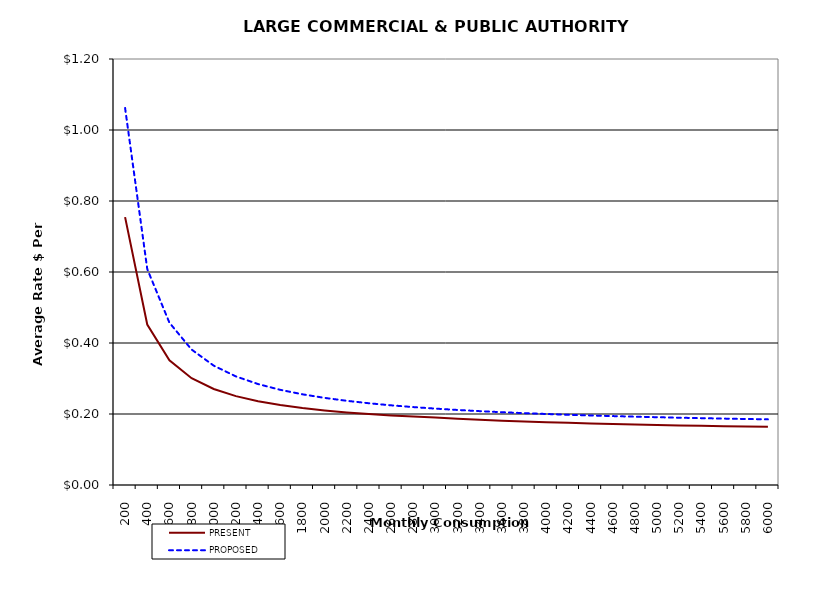
| Category | PRESENT | PROPOSED |
|---|---|---|
| 200.0 | 0.755 | 1.062 |
| 400.0 | 0.452 | 0.608 |
| 600.0 | 0.351 | 0.457 |
| 800.0 | 0.301 | 0.382 |
| 1000.0 | 0.27 | 0.336 |
| 1200.0 | 0.25 | 0.306 |
| 1400.0 | 0.236 | 0.284 |
| 1600.0 | 0.225 | 0.268 |
| 1800.0 | 0.217 | 0.255 |
| 2000.0 | 0.21 | 0.245 |
| 2200.0 | 0.204 | 0.237 |
| 2400.0 | 0.2 | 0.23 |
| 2600.0 | 0.196 | 0.224 |
| 2800.0 | 0.193 | 0.219 |
| 3000.0 | 0.19 | 0.215 |
| 3200.0 | 0.187 | 0.211 |
| 3400.0 | 0.184 | 0.208 |
| 3600.0 | 0.181 | 0.205 |
| 3800.0 | 0.179 | 0.202 |
| 4000.0 | 0.177 | 0.2 |
| 4200.0 | 0.175 | 0.198 |
| 4400.0 | 0.173 | 0.196 |
| 4600.0 | 0.172 | 0.194 |
| 4800.0 | 0.17 | 0.192 |
| 5000.0 | 0.169 | 0.191 |
| 5200.0 | 0.168 | 0.19 |
| 5400.0 | 0.167 | 0.188 |
| 5600.0 | 0.166 | 0.187 |
| 5800.0 | 0.165 | 0.186 |
| 6000.0 | 0.164 | 0.185 |